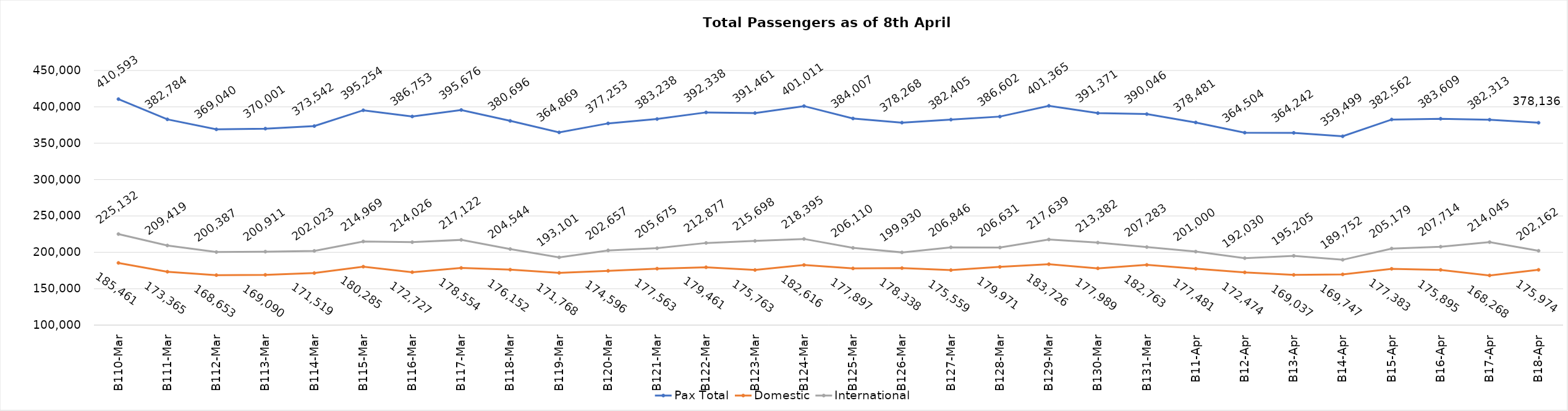
| Category | Pax Total | Domestic | International |
|---|---|---|---|
| 2024-03-10 | 410593 | 185461 | 225132 |
| 2024-03-11 | 382784 | 173365 | 209419 |
| 2024-03-12 | 369040 | 168653 | 200387 |
| 2024-03-13 | 370001 | 169090 | 200911 |
| 2024-03-14 | 373542 | 171519 | 202023 |
| 2024-03-15 | 395254 | 180285 | 214969 |
| 2024-03-16 | 386753 | 172727 | 214026 |
| 2024-03-17 | 395676 | 178554 | 217122 |
| 2024-03-18 | 380696 | 176152 | 204544 |
| 2024-03-19 | 364869 | 171768 | 193101 |
| 2024-03-20 | 377253 | 174596 | 202657 |
| 2024-03-21 | 383238 | 177563 | 205675 |
| 2024-03-22 | 392338 | 179461 | 212877 |
| 2024-03-23 | 391461 | 175763 | 215698 |
| 2024-03-24 | 401011 | 182616 | 218395 |
| 2024-03-25 | 384007 | 177897 | 206110 |
| 2024-03-26 | 378268 | 178338 | 199930 |
| 2024-03-27 | 382405 | 175559 | 206846 |
| 2024-03-28 | 386602 | 179971 | 206631 |
| 2024-03-29 | 401365 | 183726 | 217639 |
| 2024-03-30 | 391371 | 177989 | 213382 |
| 2024-03-31 | 390046 | 182763 | 207283 |
| 2024-04-01 | 378481 | 177481 | 201000 |
| 2024-04-02 | 364504 | 172474 | 192030 |
| 2024-04-03 | 364242 | 169037 | 195205 |
| 2024-04-04 | 359499 | 169747 | 189752 |
| 2024-04-05 | 382562 | 177383 | 205179 |
| 2024-04-06 | 383609 | 175895 | 207714 |
| 2024-04-07 | 382313 | 168268 | 214045 |
| 2024-04-08 | 378136 | 175974 | 202162 |